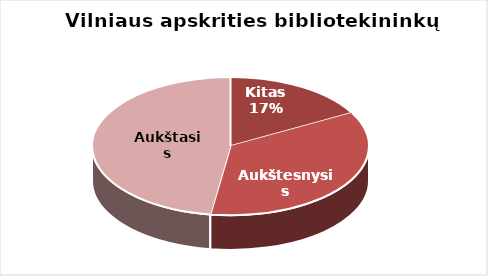
| Category | Series 0 |
|---|---|
| Kitas | 66 |
| Aukštesnysis | 137 |
| Aukštasis | 185 |